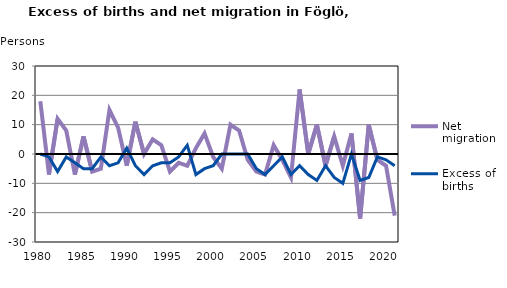
| Category | Net migration | Excess of births |
|---|---|---|
| 1980.0 | 18 | 0 |
| 1981.0 | -7 | -1 |
| 1982.0 | 12 | -6 |
| 1983.0 | 8 | -1 |
| 1984.0 | -7 | -3 |
| 1985.0 | 6 | -5 |
| 1986.0 | -6 | -5 |
| 1987.0 | -5 | -1 |
| 1988.0 | 15 | -4 |
| 1989.0 | 9 | -3 |
| 1990.0 | -4 | 2 |
| 1991.0 | 11 | -4 |
| 1992.0 | 0 | -7 |
| 1993.0 | 5 | -4 |
| 1994.0 | 3 | -3 |
| 1995.0 | -6 | -3 |
| 1996.0 | -3 | -1 |
| 1997.0 | -4 | 3 |
| 1998.0 | 2 | -7 |
| 1999.0 | 7 | -5 |
| 2000.0 | -1 | -4 |
| 2001.0 | -5 | 0 |
| 2002.0 | 10 | 0 |
| 2003.0 | 8 | 0 |
| 2004.0 | -2 | 0 |
| 2005.0 | -6 | -5 |
| 2006.0 | -7 | -7 |
| 2007.0 | 3 | -4 |
| 2008.0 | -2 | -1 |
| 2009.0 | -8 | -7 |
| 2010.0 | 22 | -4 |
| 2011.0 | 0 | -7 |
| 2012.0 | 10 | -9 |
| 2013.0 | -4 | -4 |
| 2014.0 | 6 | -8 |
| 2015.0 | -4 | -10 |
| 2016.0 | 7 | 0 |
| 2017.0 | -22 | -9 |
| 2018.0 | 10 | -8 |
| 2019.0 | -2 | -1 |
| 2020.0 | -4 | -2 |
| 2021.0 | -21 | -4 |